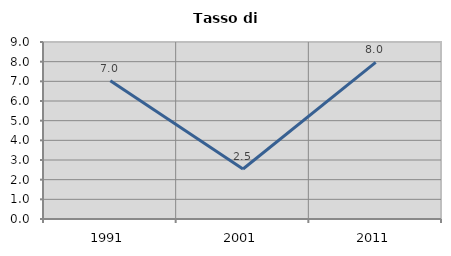
| Category | Tasso di disoccupazione   |
|---|---|
| 1991.0 | 7.029 |
| 2001.0 | 2.544 |
| 2011.0 | 7.963 |